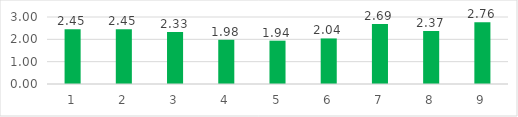
| Category | Series 0 |
|---|---|
| 0 | 2.45 |
| 1 | 2.45 |
| 2 | 2.33 |
| 3 | 1.98 |
| 4 | 1.94 |
| 5 | 2.04 |
| 6 | 2.69 |
| 7 | 2.37 |
| 8 | 2.76 |